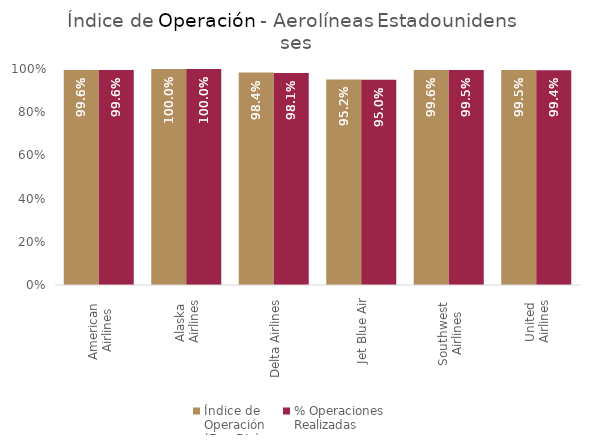
| Category | Índice de 
Operación
(Ene-Dic) | % Operaciones
Realizadas |
|---|---|---|
| American 
Airlines | 0.996 | 0.996 |
| Alaska 
Airlines | 1 | 1 |
| Delta Airlines | 0.984 | 0.981 |
| Jet Blue Air | 0.952 | 0.95 |
| Southwest 
Airlines | 0.996 | 0.995 |
| United 
Airlines | 0.995 | 0.994 |